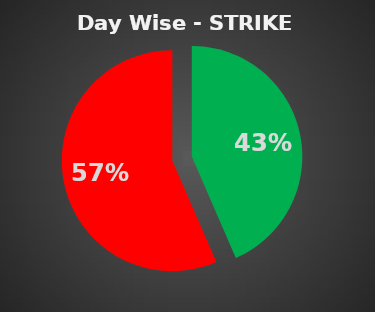
| Category | Series 0 |
|---|---|
| 0 | 0.435 |
| 1 | 0.565 |